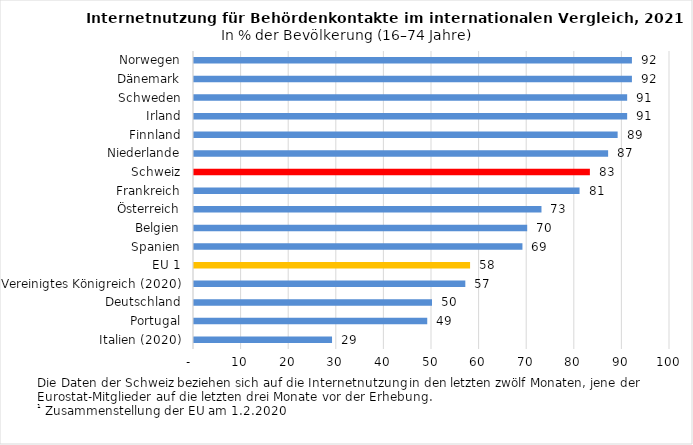
| Category | 2021 |
|---|---|
| Italien (2020) | 29 |
| Portugal | 49 |
| Deutschland | 50 |
| Vereinigtes Königreich (2020) | 57 |
| EU 1 | 58 |
| Spanien | 69 |
| Belgien | 70 |
| Österreich | 73 |
| Frankreich | 81 |
| Schweiz | 83.17 |
| Niederlande | 87 |
| Finnland | 89 |
| Irland | 91 |
| Schweden | 91 |
| Dänemark | 92 |
| Norwegen | 92 |